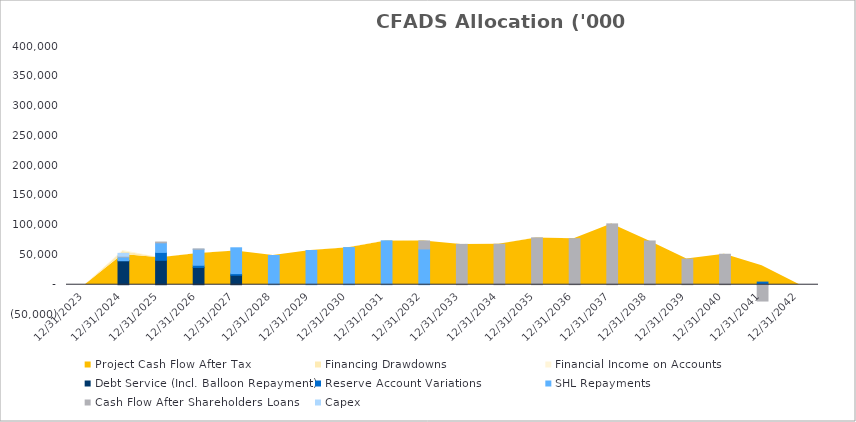
| Category | Debt Service (Incl. Balloon Repayment) | Reserve Account Variations | SHL Repayments | Cash Flow After Shareholders Loans | Capex |
|---|---|---|---|---|---|
| 12/31/23 | 0 | 0 | 0 | 0 | 0 |
| 12/31/24 | 40279.918 | 93.766 | 6126.141 | 1424.59 | 4785.288 |
| 12/31/25 | 40999.32 | 13240.793 | 16115.796 | 1322.359 | 0 |
| 12/31/26 | 28973.815 | 3707.133 | 26860.636 | 520.101 | 0 |
| 12/31/27 | 15921.462 | 2757.781 | 43335.523 | 0 | 0 |
| 12/31/28 | 0 | 0 | 49093.031 | 0 | 0 |
| 12/31/29 | 0 | 0 | 57461.818 | 0 | 0 |
| 12/31/30 | 0 | 0 | 62372.001 | 0 | 0 |
| 12/31/31 | 0 | 0 | 73739.818 | 0 | 0 |
| 12/31/32 | 0 | 0 | 60067.05 | 13492.474 | 0 |
| 12/31/33 | 0 | 0 | 0 | 67742.109 | 0 |
| 12/31/34 | 0 | 0 | 0 | 68003.258 | 0 |
| 12/31/35 | 0 | 0 | 0 | 78733.108 | 0 |
| 12/31/36 | 0 | 0 | 0 | 77293.933 | 0 |
| 12/31/37 | 0 | 0 | 0 | 102139.06 | 0 |
| 12/31/38 | 0 | 0 | 0 | 73455.35 | 0 |
| 12/31/39 | 0 | 0 | 0 | 43074.609 | 0 |
| 12/31/40 | 0 | 0 | 0 | 51168.198 | 0 |
| 12/31/41 | 0 | 4404.426 | 0 | -27373.105 | 0 |
| 12/31/42 | 0 | 0 | 0 | 0 | 0 |
| 12/31/43 | 0 | 0 | 0 | 0 | 0 |
| 12/31/44 | 0 | 0 | 0 | 0 | 0 |
| 12/31/45 | 0 | 0 | 0 | 0 | 0 |
| 12/31/46 | 0 | 0 | 0 | 0 | 0 |
| 12/31/47 | 0 | 0 | 0 | 0 | 0 |
| 12/31/48 | 0 | 0 | 0 | 0 | 0 |
| 12/31/49 | 0 | 0 | 0 | 0 | 0 |
| 12/31/50 | 0 | 0 | 0 | 0 | 0 |
| 12/31/51 | 0 | 0 | 0 | 0 | 0 |
| 12/31/52 | 0 | 0 | 0 | 0 | 0 |
| 12/31/53 | 0 | 0 | 0 | 0 | 0 |
| 12/31/54 | 0 | 0 | 0 | 0 | 0 |
| 12/31/55 | 0 | 0 | 0 | 0 | 0 |
| 12/31/56 | 0 | 0 | 0 | 0 | 0 |
| 12/31/57 | 0 | 0 | 0 | 0 | 0 |
| 12/31/58 | 0 | 0 | 0 | 0 | 0 |
| 12/31/59 | 0 | 0 | 0 | 0 | 0 |
| 12/31/60 | 0 | 0 | 0 | 0 | 0 |
| 12/31/61 | 0 | 0 | 0 | 0 | 0 |
| 12/31/62 | 0 | 0 | 0 | 0 | 0 |
| 12/31/63 | 0 | 0 | 0 | 0 | 0 |
| 12/31/64 | 0 | 0 | 0 | 0 | 0 |
| 12/31/65 | 0 | 0 | 0 | 0 | 0 |
| 12/31/66 | 0 | 0 | 0 | 0 | 0 |
| 12/31/67 | 0 | 0 | 0 | 0 | 0 |
| 12/31/68 | 0 | 0 | 0 | 0 | 0 |
| 12/31/69 | 0 | 0 | 0 | 0 | 0 |
| 12/31/70 | 0 | 0 | 0 | 0 | 0 |
| 12/31/71 | 0 | 0 | 0 | 0 | 0 |
| 12/31/72 | 0 | 0 | 0 | 0 | 0 |
| 12/31/73 | 0 | 0 | 0 | 0 | 0 |
| 12/31/74 | 0 | 0 | 0 | 0 | 0 |
| 12/31/75 | 0 | 0 | 0 | 0 | 0 |
| 12/31/76 | 0 | 0 | 0 | 0 | 0 |
| 12/31/77 | 0 | 0 | 0 | 0 | 0 |
| 12/31/78 | 0 | 0 | 0 | 0 | 0 |
| 12/31/79 | 0 | 0 | 0 | 0 | 0 |
| 12/31/80 | 0 | 0 | 0 | 0 | 0 |
| 12/31/81 | 0 | 0 | 0 | 0 | 0 |
| 12/31/82 | 0 | 0 | 0 | 0 | 0 |